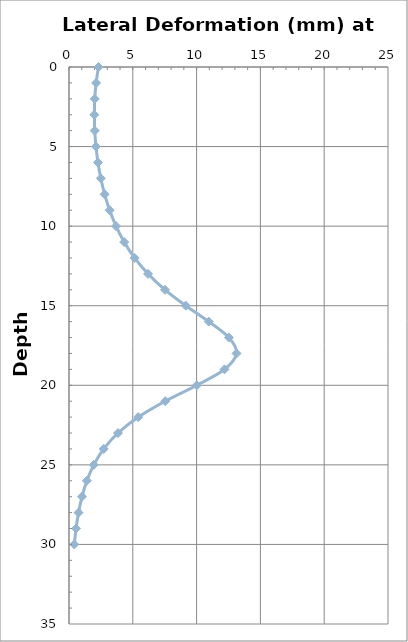
| Category | Series 0 |
|---|---|
| 2.315330039023422 | 0 |
| 2.1233264580581954 | 1 |
| 2.0157652337271377 | 2 |
| 1.9815589986125972 | 3 |
| 2.013774377012367 | 4 |
| 2.109133056883697 | 5 |
| 2.267873665116029 | 6 |
| 2.493961941567674 | 7 |
| 2.795679831877908 | 8 |
| 3.1866572547982477 | 9 |
| 3.6874090896770757 | 10 |
| 4.327317542458228 | 11 |
| 5.146490984145908 | 12 |
| 6.195288680656287 | 13 |
| 7.52468177236053 | 14 |
| 9.149836209503437 | 15 |
| 10.954421699510965 | 16 |
| 12.5283859354269 | 17 |
| 13.129088308102805 | 18 |
| 12.1850023329985 | 19 |
| 10.015159133377976 | 20 |
| 7.541992365141228 | 21 |
| 5.424482686646354 | 22 |
| 3.8398284982522957 | 23 |
| 2.7192789795753787 | 24 |
| 1.9406159666611968 | 25 |
| 1.3989888764049225 | 26 |
| 1.0188785427708686 | 27 |
| 0.7490015437977978 | 28 |
| 0.5550910539184593 | 29 |
| 0.41420270363643835 | 30 |